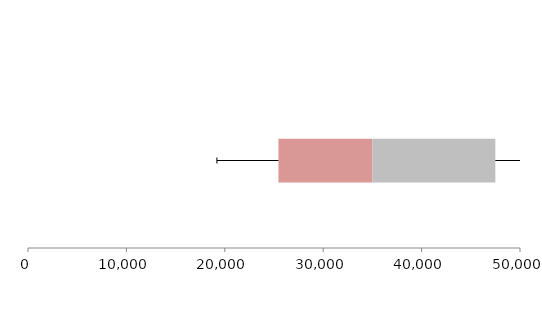
| Category | Series 1 | Series 2 | Series 3 |
|---|---|---|---|
| 0 | 25451.838 | 9551.957 | 12489.863 |